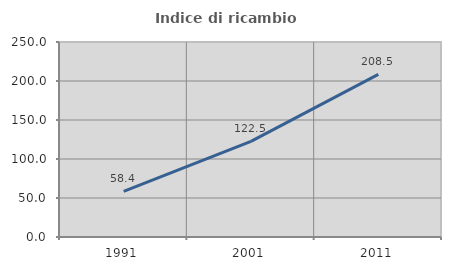
| Category | Indice di ricambio occupazionale  |
|---|---|
| 1991.0 | 58.447 |
| 2001.0 | 122.527 |
| 2011.0 | 208.485 |